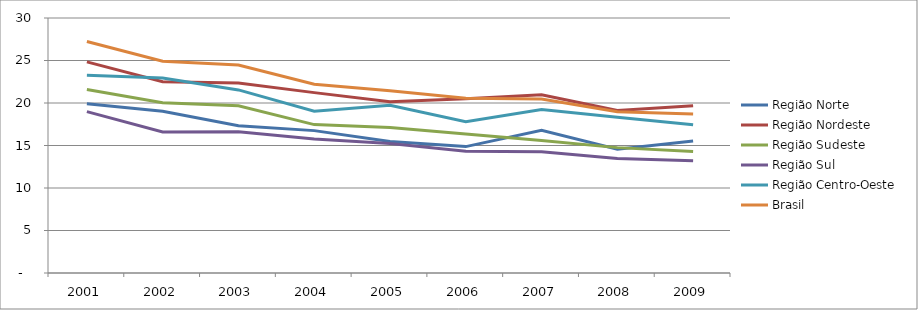
| Category | Região Norte | Região Nordeste | Região Sudeste | Região Sul | Região Centro-Oeste | Brasil |
|---|---|---|---|---|---|---|
| 2001.0 | 19.9 | 24.84 | 21.59 | 18.98 | 23.26 | 27.24 |
| 2002.0 | 19.03 | 22.5 | 20.03 | 16.59 | 22.95 | 24.92 |
| 2003.0 | 17.32 | 22.34 | 19.68 | 16.63 | 21.54 | 24.47 |
| 2004.0 | 16.75 | 21.22 | 17.46 | 15.77 | 19.04 | 22.2 |
| 2005.0 | 15.46 | 20.15 | 17.12 | 15.24 | 19.74 | 21.43 |
| 2006.0 | 14.87 | 20.49 | 16.34 | 14.33 | 17.79 | 20.56 |
| 2007.0 | 16.8 | 20.98 | 15.59 | 14.26 | 19.22 | 20.47 |
| 2008.0 | 14.57 | 19.11 | 14.75 | 13.48 | 18.33 | 18.98 |
| 2009.0 | 15.54 | 19.69 | 14.3 | 13.22 | 17.44 | 18.7 |